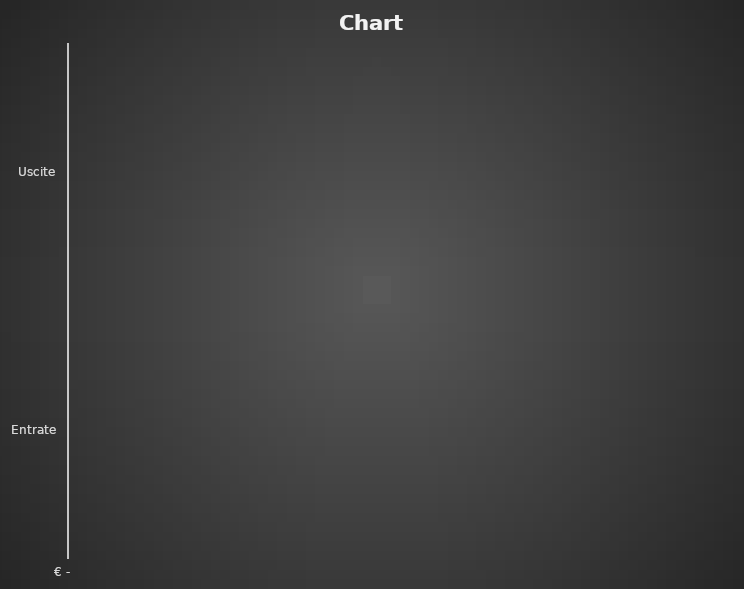
| Category | Series 0 |
|---|---|
| Entrate | 0 |
| Uscite | 0 |